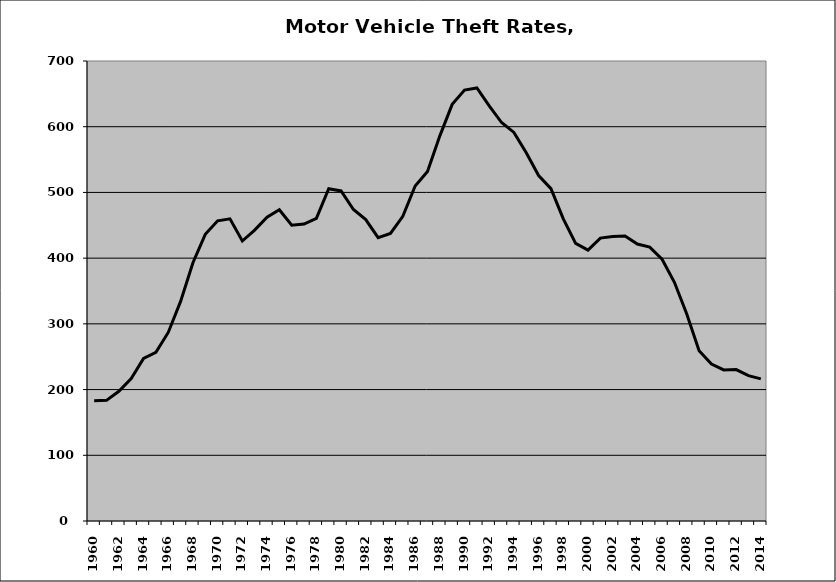
| Category | Motor Vehicle |
|---|---|
| 1960.0 | 183.022 |
| 1961.0 | 183.615 |
| 1962.0 | 197.447 |
| 1963.0 | 216.624 |
| 1964.0 | 247.357 |
| 1965.0 | 256.761 |
| 1966.0 | 286.947 |
| 1967.0 | 334.149 |
| 1968.0 | 392.981 |
| 1969.0 | 436.229 |
| 1970.0 | 456.81 |
| 1971.0 | 459.818 |
| 1972.0 | 426.067 |
| 1973.0 | 442.6 |
| 1974.0 | 462.222 |
| 1975.0 | 473.715 |
| 1976.0 | 450.016 |
| 1977.0 | 451.944 |
| 1978.0 | 460.472 |
| 1979.0 | 505.591 |
| 1980.0 | 502.198 |
| 1981.0 | 474.058 |
| 1982.0 | 458.594 |
| 1983.0 | 431.124 |
| 1984.0 | 437.683 |
| 1985.0 | 463.536 |
| 1986.0 | 509.775 |
| 1987.0 | 531.875 |
| 1988.0 | 586.062 |
| 1989.0 | 633.986 |
| 1990.0 | 655.768 |
| 1991.0 | 659.019 |
| 1992.0 | 631.626 |
| 1993.0 | 606.348 |
| 1994.0 | 591.29 |
| 1995.0 | 560.283 |
| 1996.0 | 525.674 |
| 1997.0 | 505.703 |
| 1998.0 | 459.867 |
| 1999.0 | 422.484 |
| 2000.0 | 412.193 |
| 2001.0 | 430.535 |
| 2002.0 | 432.902 |
| 2003.0 | 433.726 |
| 2004.0 | 421.53 |
| 2005.0 | 416.806 |
| 2006.0 | 398.402 |
| 2007.0 | 363.293 |
| 2008.0 | 314.95 |
| 2009.0 | 259.165 |
| 2010.0 | 238.754 |
| 2011.0 | 229.954 |
| 2012.0 | 230.407 |
| 2013.0 | 221.264 |
| 2014.0 | 216.25 |